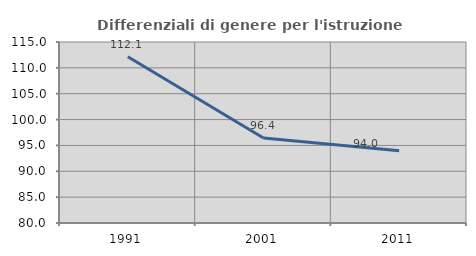
| Category | Differenziali di genere per l'istruzione superiore |
|---|---|
| 1991.0 | 112.142 |
| 2001.0 | 96.421 |
| 2011.0 | 93.955 |